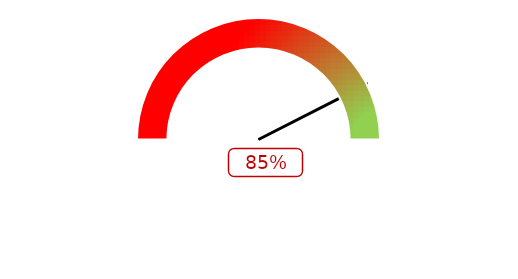
| Category | Стрелка |
|---|---|
| 0 | 0.85 |
| 1 | 0 |
| 2 | 1.15 |